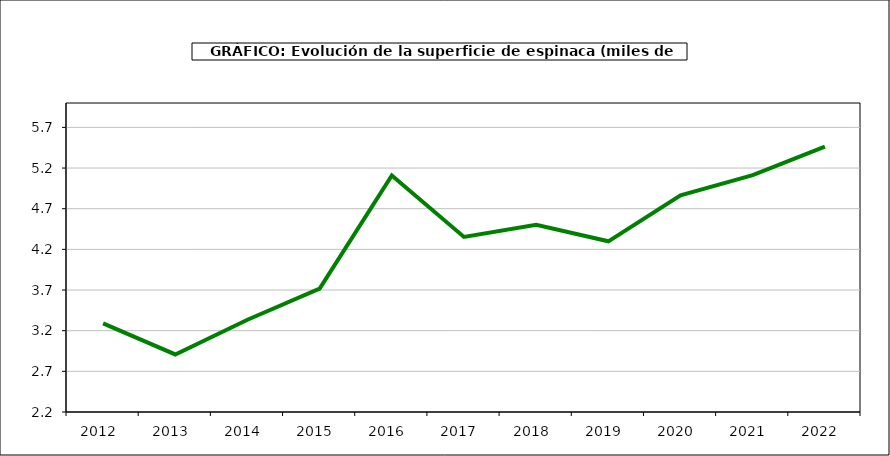
| Category | superficie |
|---|---|
| 2012.0 | 3.289 |
| 2013.0 | 2.908 |
| 2014.0 | 3.335 |
| 2015.0 | 3.717 |
| 2016.0 | 5.108 |
| 2017.0 | 4.353 |
| 2018.0 | 4.501 |
| 2019.0 | 4.299 |
| 2020.0 | 4.864 |
| 2021.0 | 5.112 |
| 2022.0 | 5.463 |